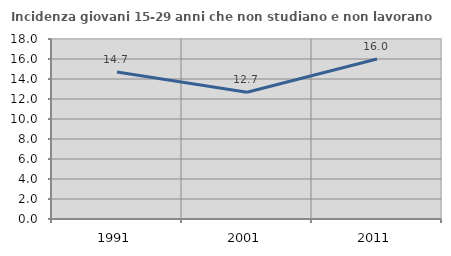
| Category | Incidenza giovani 15-29 anni che non studiano e non lavorano  |
|---|---|
| 1991.0 | 14.706 |
| 2001.0 | 12.676 |
| 2011.0 | 16 |